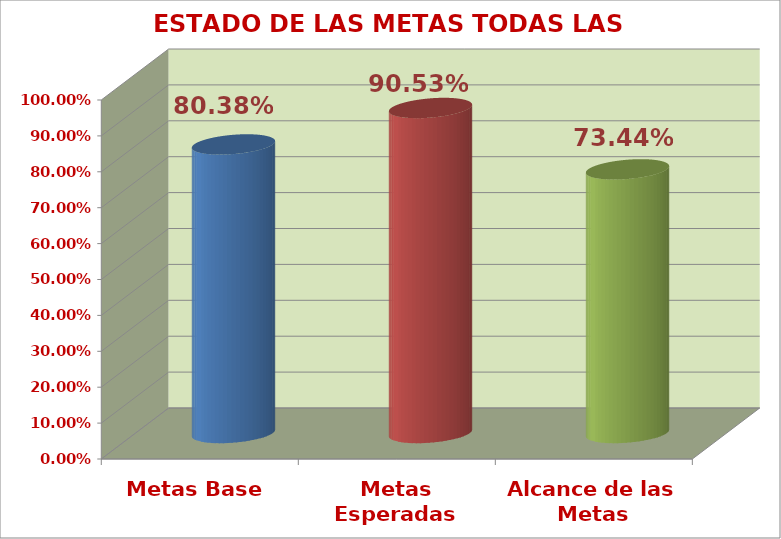
| Category | ESTADO DE LAS METAS TODAS LAS GESTIONES |
|---|---|
| Metas Base | 0.804 |
| Metas Esperadas | 0.905 |
| Alcance de las Metas | 0.734 |